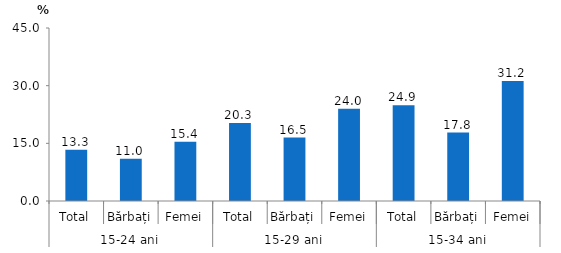
| Category | Series 0 |
|---|---|
| 0 | 13.3 |
| 1 | 11 |
| 2 | 15.4 |
| 3 | 20.3 |
| 4 | 16.5 |
| 5 | 24 |
| 6 | 24.9 |
| 7 | 17.8 |
| 8 | 31.2 |